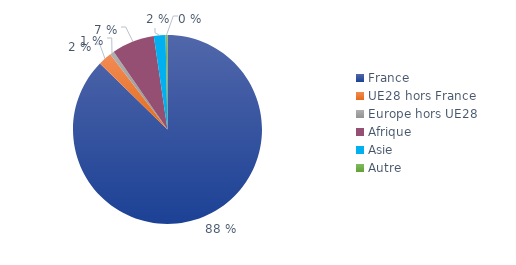
| Category | Series 0 |
|---|---|
| France | 0.879 |
| UE28 hors France | 0.023 |
| Europe hors UE28 | 0.007 |
| Afrique | 0.074 |
| Asie | 0.02 |
| Autre | 0.003 |